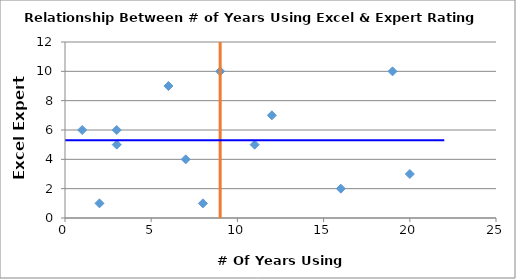
| Category | Excel Expert Rating |
|---|---|
| 3.0 | 5 |
| 8.0 | 1 |
| 6.0 | 9 |
| 11.0 | 5 |
| 20.0 | 3 |
| 7.0 | 4 |
| 9.0 | 10 |
| 3.0 | 6 |
| 19.0 | 10 |
| 2.0 | 1 |
| 16.0 | 2 |
| 12.0 | 7 |
| 1.0 | 6 |